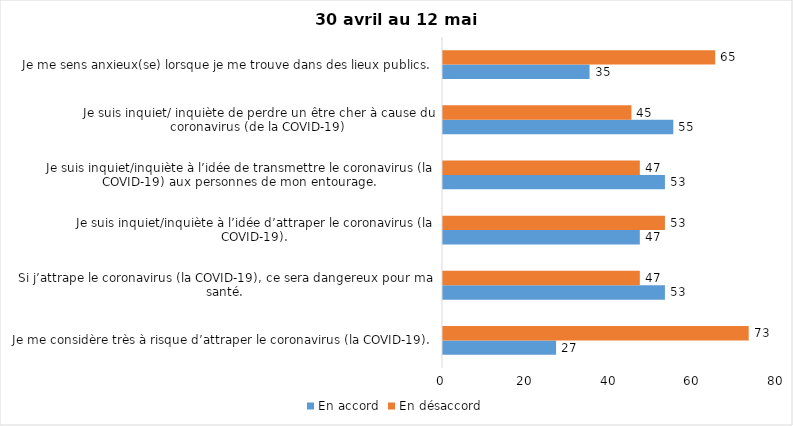
| Category | En accord | En désaccord |
|---|---|---|
| Je me considère très à risque d’attraper le coronavirus (la COVID-19). | 27 | 73 |
| Si j’attrape le coronavirus (la COVID-19), ce sera dangereux pour ma santé. | 53 | 47 |
| Je suis inquiet/inquiète à l’idée d’attraper le coronavirus (la COVID-19). | 47 | 53 |
| Je suis inquiet/inquiète à l’idée de transmettre le coronavirus (la COVID-19) aux personnes de mon entourage. | 53 | 47 |
| Je suis inquiet/ inquiète de perdre un être cher à cause du coronavirus (de la COVID-19) | 55 | 45 |
| Je me sens anxieux(se) lorsque je me trouve dans des lieux publics. | 35 | 65 |